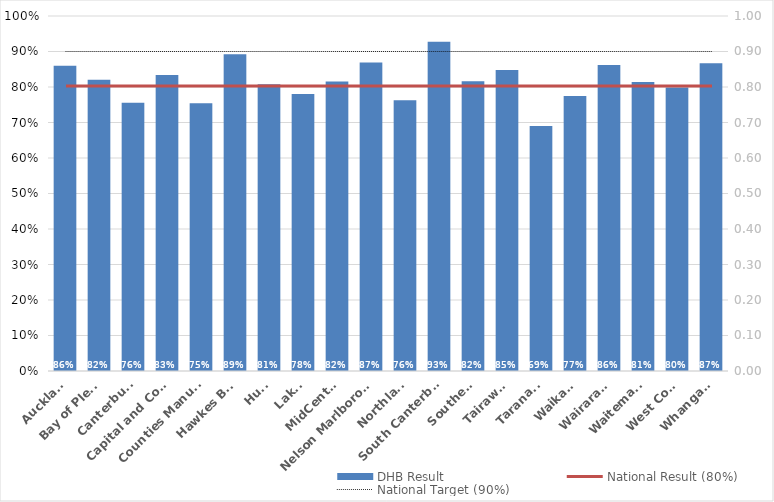
| Category | DHB Result |
|---|---|
| Auckland | 0.86 |
| Bay of Plenty | 0.82 |
| Canterbury | 0.756 |
| Capital and Coast | 0.834 |
| Counties Manukau | 0.754 |
| Hawkes Bay | 0.892 |
| Hutt | 0.808 |
| Lakes | 0.78 |
| MidCentral | 0.815 |
| Nelson Marlborough | 0.869 |
| Northland | 0.763 |
| South Canterbury | 0.928 |
| Southern | 0.816 |
| Tairawhiti | 0.848 |
| Taranaki | 0.69 |
| Waikato | 0.774 |
| Wairarapa | 0.862 |
| Waitemata | 0.814 |
| West Coast | 0.798 |
| Whanganui | 0.867 |